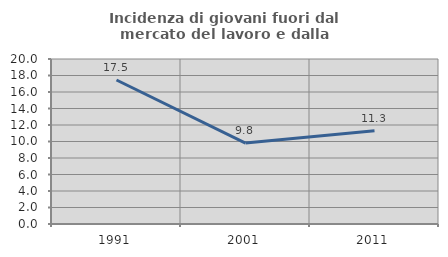
| Category | Incidenza di giovani fuori dal mercato del lavoro e dalla formazione  |
|---|---|
| 1991.0 | 17.453 |
| 2001.0 | 9.804 |
| 2011.0 | 11.299 |